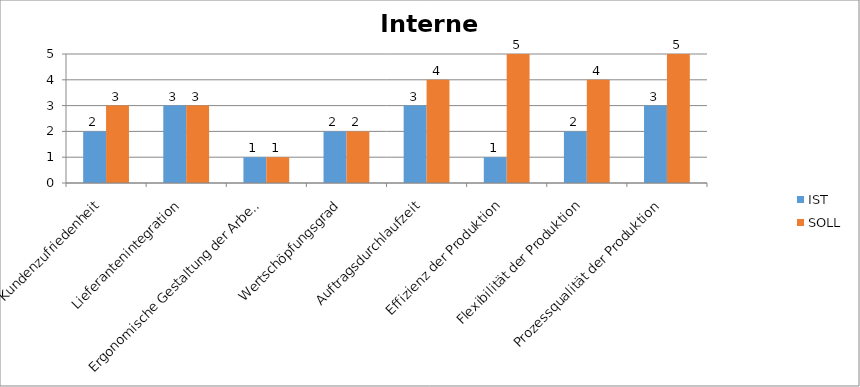
| Category | IST | SOLL |
|---|---|---|
| Kundenzufriedenheit | 2 | 3 |
| Lieferantenintegration | 3 | 3 |
| Ergonomische Gestaltung der Arbeitsplätze | 1 | 1 |
| Wertschöpfungsgrad | 2 | 2 |
| Auftragsdurchlaufzeit | 3 | 4 |
| Effizienz der Produktion | 1 | 5 |
| Flexibilität der Produktion | 2 | 4 |
| Prozessqualität der Produktion | 3 | 5 |